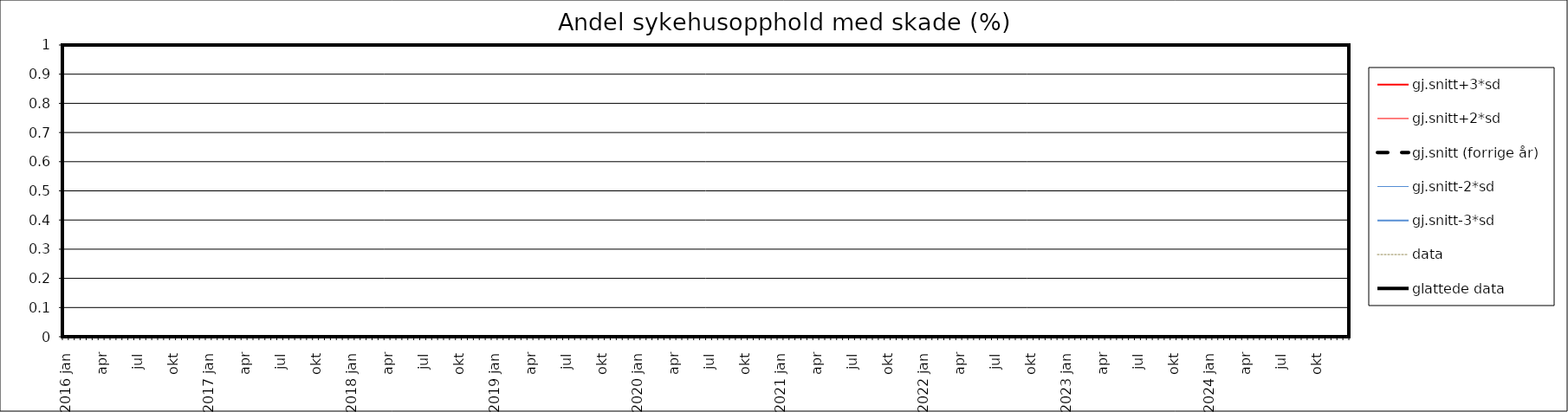
| Category | gj.snitt+3*sd | gj.snitt+2*sd | gj.snitt (forrige år) | gj.snitt-2*sd | gj.snitt-3*sd | data | glattede data |
|---|---|---|---|---|---|---|---|
| 2016 jan | 0 | 0 | 0 | 0 | 0 | 0 | 0 |
|  | 0 | 0 | 0 | 0 | 0 | 0 | 0 |
| feb | 0 | 0 | 0 | 0 | 0 | 0 | 0 |
|  | 0 | 0 | 0 | 0 | 0 | 0 | 0 |
| mar | 0 | 0 | 0 | 0 | 0 | 0 | 0 |
|  | 0 | 0 | 0 | 0 | 0 | 0 | 0 |
| apr | 0 | 0 | 0 | 0 | 0 | 0 | 0 |
|  | 0 | 0 | 0 | 0 | 0 | 0 | 0 |
| mai | 0 | 0 | 0 | 0 | 0 | 0 | 0 |
|  | 0 | 0 | 0 | 0 | 0 | 0 | 0 |
| jun | 0 | 0 | 0 | 0 | 0 | 0 | 0 |
|  | 0 | 0 | 0 | 0 | 0 | 0 | 0 |
| jul | 0 | 0 | 0 | 0 | 0 | 0 | 0 |
|  | 0 | 0 | 0 | 0 | 0 | 0 | 0 |
| aug | 0 | 0 | 0 | 0 | 0 | 0 | 0 |
|  | 0 | 0 | 0 | 0 | 0 | 0 | 0 |
| sep | 0 | 0 | 0 | 0 | 0 | 0 | 0 |
|  | 0 | 0 | 0 | 0 | 0 | 0 | 0 |
| okt | 0 | 0 | 0 | 0 | 0 | 0 | 0 |
|  | 0 | 0 | 0 | 0 | 0 | 0 | 0 |
| nov | 0 | 0 | 0 | 0 | 0 | 0 | 0 |
|  | 0 | 0 | 0 | 0 | 0 | 0 | 0 |
| des | 0 | 0 | 0 | 0 | 0 | 0 | 0 |
|  | 0 | 0 | 0 | 0 | 0 | 0 | 0 |
| 2017 jan | 0 | 0 | 0 | 0 | 0 | 0 | 0 |
|  | 0 | 0 | 0 | 0 | 0 | 0 | 0 |
| feb | 0 | 0 | 0 | 0 | 0 | 0 | 0 |
|  | 0 | 0 | 0 | 0 | 0 | 0 | 0 |
| mar | 0 | 0 | 0 | 0 | 0 | 0 | 0 |
|  | 0 | 0 | 0 | 0 | 0 | 0 | 0 |
| apr | 0 | 0 | 0 | 0 | 0 | 0 | 0 |
|  | 0 | 0 | 0 | 0 | 0 | 0 | 0 |
| mai | 0 | 0 | 0 | 0 | 0 | 0 | 0 |
|  | 0 | 0 | 0 | 0 | 0 | 0 | 0 |
| jun | 0 | 0 | 0 | 0 | 0 | 0 | 0 |
|  | 0 | 0 | 0 | 0 | 0 | 0 | 0 |
| jul | 0 | 0 | 0 | 0 | 0 | 0 | 0 |
|  | 0 | 0 | 0 | 0 | 0 | 0 | 0 |
| aug | 0 | 0 | 0 | 0 | 0 | 0 | 0 |
|  | 0 | 0 | 0 | 0 | 0 | 0 | 0 |
| sep | 0 | 0 | 0 | 0 | 0 | 0 | 0 |
|  | 0 | 0 | 0 | 0 | 0 | 0 | 0 |
| okt | 0 | 0 | 0 | 0 | 0 | 0 | 0 |
|  | 0 | 0 | 0 | 0 | 0 | 0 | 0 |
| nov | 0 | 0 | 0 | 0 | 0 | 0 | 0 |
|  | 0 | 0 | 0 | 0 | 0 | 0 | 0 |
| des | 0 | 0 | 0 | 0 | 0 | 0 | 0 |
|  | 0 | 0 | 0 | 0 | 0 | 0 | 0 |
| 2018 jan | 0 | 0 | 0 | 0 | 0 | 0 | 0 |
|  | 0 | 0 | 0 | 0 | 0 | 0 | 0 |
| feb | 0 | 0 | 0 | 0 | 0 | 0 | 0 |
|  | 0 | 0 | 0 | 0 | 0 | 0 | 0 |
| mar | 0 | 0 | 0 | 0 | 0 | 0 | 0 |
|  | 0 | 0 | 0 | 0 | 0 | 0 | 0 |
| apr | 0 | 0 | 0 | 0 | 0 | 0 | 0 |
|  | 0 | 0 | 0 | 0 | 0 | 0 | 0 |
| mai | 0 | 0 | 0 | 0 | 0 | 0 | 0 |
|  | 0 | 0 | 0 | 0 | 0 | 0 | 0 |
| jun | 0 | 0 | 0 | 0 | 0 | 0 | 0 |
|  | 0 | 0 | 0 | 0 | 0 | 0 | 0 |
| jul | 0 | 0 | 0 | 0 | 0 | 0 | 0 |
|  | 0 | 0 | 0 | 0 | 0 | 0 | 0 |
| aug | 0 | 0 | 0 | 0 | 0 | 0 | 0 |
|  | 0 | 0 | 0 | 0 | 0 | 0 | 0 |
| sep | 0 | 0 | 0 | 0 | 0 | 0 | 0 |
|  | 0 | 0 | 0 | 0 | 0 | 0 | 0 |
| okt | 0 | 0 | 0 | 0 | 0 | 0 | 0 |
|  | 0 | 0 | 0 | 0 | 0 | 0 | 0 |
| nov | 0 | 0 | 0 | 0 | 0 | 0 | 0 |
|  | 0 | 0 | 0 | 0 | 0 | 0 | 0 |
| des | 0 | 0 | 0 | 0 | 0 | 0 | 0 |
|  | 0 | 0 | 0 | 0 | 0 | 0 | 0 |
| 2019 jan | 0 | 0 | 0 | 0 | 0 | 0 | 0 |
|  | 0 | 0 | 0 | 0 | 0 | 0 | 0 |
| feb | 0 | 0 | 0 | 0 | 0 | 0 | 0 |
|  | 0 | 0 | 0 | 0 | 0 | 0 | 0 |
| mar | 0 | 0 | 0 | 0 | 0 | 0 | 0 |
|  | 0 | 0 | 0 | 0 | 0 | 0 | 0 |
| apr | 0 | 0 | 0 | 0 | 0 | 0 | 0 |
|  | 0 | 0 | 0 | 0 | 0 | 0 | 0 |
| mai | 0 | 0 | 0 | 0 | 0 | 0 | 0 |
|  | 0 | 0 | 0 | 0 | 0 | 0 | 0 |
| jun | 0 | 0 | 0 | 0 | 0 | 0 | 0 |
|  | 0 | 0 | 0 | 0 | 0 | 0 | 0 |
| jul | 0 | 0 | 0 | 0 | 0 | 0 | 0 |
|  | 0 | 0 | 0 | 0 | 0 | 0 | 0 |
| aug | 0 | 0 | 0 | 0 | 0 | 0 | 0 |
|  | 0 | 0 | 0 | 0 | 0 | 0 | 0 |
| sep | 0 | 0 | 0 | 0 | 0 | 0 | 0 |
|  | 0 | 0 | 0 | 0 | 0 | 0 | 0 |
| okt | 0 | 0 | 0 | 0 | 0 | 0 | 0 |
|  | 0 | 0 | 0 | 0 | 0 | 0 | 0 |
| nov | 0 | 0 | 0 | 0 | 0 | 0 | 0 |
|  | 0 | 0 | 0 | 0 | 0 | 0 | 0 |
| des | 0 | 0 | 0 | 0 | 0 | 0 | 0 |
|  | 0 | 0 | 0 | 0 | 0 | 0 | 0 |
| 2020 jan | 0 | 0 | 0 | 0 | 0 | 0 | 0 |
|  | 0 | 0 | 0 | 0 | 0 | 0 | 0 |
| feb | 0 | 0 | 0 | 0 | 0 | 0 | 0 |
|  | 0 | 0 | 0 | 0 | 0 | 0 | 0 |
| mar | 0 | 0 | 0 | 0 | 0 | 0 | 0 |
|  | 0 | 0 | 0 | 0 | 0 | 0 | 0 |
| apr | 0 | 0 | 0 | 0 | 0 | 0 | 0 |
|  | 0 | 0 | 0 | 0 | 0 | 0 | 0 |
| mai | 0 | 0 | 0 | 0 | 0 | 0 | 0 |
|  | 0 | 0 | 0 | 0 | 0 | 0 | 0 |
| jun | 0 | 0 | 0 | 0 | 0 | 0 | 0 |
|  | 0 | 0 | 0 | 0 | 0 | 0 | 0 |
| jul | 0 | 0 | 0 | 0 | 0 | 0 | 0 |
|  | 0 | 0 | 0 | 0 | 0 | 0 | 0 |
| aug | 0 | 0 | 0 | 0 | 0 | 0 | 0 |
|  | 0 | 0 | 0 | 0 | 0 | 0 | 0 |
| sep | 0 | 0 | 0 | 0 | 0 | 0 | 0 |
|  | 0 | 0 | 0 | 0 | 0 | 0 | 0 |
| okt | 0 | 0 | 0 | 0 | 0 | 0 | 0 |
|  | 0 | 0 | 0 | 0 | 0 | 0 | 0 |
| nov | 0 | 0 | 0 | 0 | 0 | 0 | 0 |
|  | 0 | 0 | 0 | 0 | 0 | 0 | 0 |
| des | 0 | 0 | 0 | 0 | 0 | 0 | 0 |
|  | 0 | 0 | 0 | 0 | 0 | 0 | 0 |
| 2021 jan | 0 | 0 | 0 | 0 | 0 | 0 | 0 |
|  | 0 | 0 | 0 | 0 | 0 | 0 | 0 |
| feb | 0 | 0 | 0 | 0 | 0 | 0 | 0 |
|  | 0 | 0 | 0 | 0 | 0 | 0 | 0 |
| mar | 0 | 0 | 0 | 0 | 0 | 0 | 0 |
|  | 0 | 0 | 0 | 0 | 0 | 0 | 0 |
| apr | 0 | 0 | 0 | 0 | 0 | 0 | 0 |
|  | 0 | 0 | 0 | 0 | 0 | 0 | 0 |
| mai | 0 | 0 | 0 | 0 | 0 | 0 | 0 |
|  | 0 | 0 | 0 | 0 | 0 | 0 | 0 |
| jun | 0 | 0 | 0 | 0 | 0 | 0 | 0 |
|  | 0 | 0 | 0 | 0 | 0 | 0 | 0 |
| jul | 0 | 0 | 0 | 0 | 0 | 0 | 0 |
|  | 0 | 0 | 0 | 0 | 0 | 0 | 0 |
| aug | 0 | 0 | 0 | 0 | 0 | 0 | 0 |
|  | 0 | 0 | 0 | 0 | 0 | 0 | 0 |
| sep | 0 | 0 | 0 | 0 | 0 | 0 | 0 |
|  | 0 | 0 | 0 | 0 | 0 | 0 | 0 |
| okt | 0 | 0 | 0 | 0 | 0 | 0 | 0 |
|  | 0 | 0 | 0 | 0 | 0 | 0 | 0 |
| nov | 0 | 0 | 0 | 0 | 0 | 0 | 0 |
|  | 0 | 0 | 0 | 0 | 0 | 0 | 0 |
| des | 0 | 0 | 0 | 0 | 0 | 0 | 0 |
|  | 0 | 0 | 0 | 0 | 0 | 0 | 0 |
| 2022 jan | 0 | 0 | 0 | 0 | 0 | 0 | 0 |
|  | 0 | 0 | 0 | 0 | 0 | 0 | 0 |
| feb | 0 | 0 | 0 | 0 | 0 | 0 | 0 |
|  | 0 | 0 | 0 | 0 | 0 | 0 | 0 |
| mar | 0 | 0 | 0 | 0 | 0 | 0 | 0 |
|  | 0 | 0 | 0 | 0 | 0 | 0 | 0 |
| apr | 0 | 0 | 0 | 0 | 0 | 0 | 0 |
|  | 0 | 0 | 0 | 0 | 0 | 0 | 0 |
| mai | 0 | 0 | 0 | 0 | 0 | 0 | 0 |
|  | 0 | 0 | 0 | 0 | 0 | 0 | 0 |
| jun | 0 | 0 | 0 | 0 | 0 | 0 | 0 |
|  | 0 | 0 | 0 | 0 | 0 | 0 | 0 |
| jul | 0 | 0 | 0 | 0 | 0 | 0 | 0 |
|  | 0 | 0 | 0 | 0 | 0 | 0 | 0 |
| aug | 0 | 0 | 0 | 0 | 0 | 0 | 0 |
|  | 0 | 0 | 0 | 0 | 0 | 0 | 0 |
| sep | 0 | 0 | 0 | 0 | 0 | 0 | 0 |
|  | 0 | 0 | 0 | 0 | 0 | 0 | 0 |
| okt | 0 | 0 | 0 | 0 | 0 | 0 | 0 |
|  | 0 | 0 | 0 | 0 | 0 | 0 | 0 |
| nov | 0 | 0 | 0 | 0 | 0 | 0 | 0 |
|  | 0 | 0 | 0 | 0 | 0 | 0 | 0 |
| des | 0 | 0 | 0 | 0 | 0 | 0 | 0 |
|  | 0 | 0 | 0 | 0 | 0 | 0 | 0 |
| 2023 jan | 0 | 0 | 0 | 0 | 0 | 0 | 0 |
|  | 0 | 0 | 0 | 0 | 0 | 0 | 0 |
| feb | 0 | 0 | 0 | 0 | 0 | 0 | 0 |
|  | 0 | 0 | 0 | 0 | 0 | 0 | 0 |
| mar | 0 | 0 | 0 | 0 | 0 | 0 | 0 |
|  | 0 | 0 | 0 | 0 | 0 | 0 | 0 |
| apr | 0 | 0 | 0 | 0 | 0 | 0 | 0 |
|  | 0 | 0 | 0 | 0 | 0 | 0 | 0 |
| mai | 0 | 0 | 0 | 0 | 0 | 0 | 0 |
|  | 0 | 0 | 0 | 0 | 0 | 0 | 0 |
| jun | 0 | 0 | 0 | 0 | 0 | 0 | 0 |
|  | 0 | 0 | 0 | 0 | 0 | 0 | 0 |
| jul | 0 | 0 | 0 | 0 | 0 | 0 | 0 |
|  | 0 | 0 | 0 | 0 | 0 | 0 | 0 |
| aug | 0 | 0 | 0 | 0 | 0 | 0 | 0 |
|  | 0 | 0 | 0 | 0 | 0 | 0 | 0 |
| sep | 0 | 0 | 0 | 0 | 0 | 0 | 0 |
|  | 0 | 0 | 0 | 0 | 0 | 0 | 0 |
| okt | 0 | 0 | 0 | 0 | 0 | 0 | 0 |
|  | 0 | 0 | 0 | 0 | 0 | 0 | 0 |
| nov | 0 | 0 | 0 | 0 | 0 | 0 | 0 |
|  | 0 | 0 | 0 | 0 | 0 | 0 | 0 |
| des | 0 | 0 | 0 | 0 | 0 | 0 | 0 |
|  | 0 | 0 | 0 | 0 | 0 | 0 | 0 |
| 2024 jan | 0 | 0 | 0 | 0 | 0 | 0 | 0 |
|  | 0 | 0 | 0 | 0 | 0 | 0 | 0 |
| feb | 0 | 0 | 0 | 0 | 0 | 0 | 0 |
|  | 0 | 0 | 0 | 0 | 0 | 0 | 0 |
| mar | 0 | 0 | 0 | 0 | 0 | 0 | 0 |
|  | 0 | 0 | 0 | 0 | 0 | 0 | 0 |
| apr | 0 | 0 | 0 | 0 | 0 | 0 | 0 |
|  | 0 | 0 | 0 | 0 | 0 | 0 | 0 |
| mai | 0 | 0 | 0 | 0 | 0 | 0 | 0 |
|  | 0 | 0 | 0 | 0 | 0 | 0 | 0 |
| jun | 0 | 0 | 0 | 0 | 0 | 0 | 0 |
|  | 0 | 0 | 0 | 0 | 0 | 0 | 0 |
| jul | 0 | 0 | 0 | 0 | 0 | 0 | 0 |
|  | 0 | 0 | 0 | 0 | 0 | 0 | 0 |
| aug | 0 | 0 | 0 | 0 | 0 | 0 | 0 |
|  | 0 | 0 | 0 | 0 | 0 | 0 | 0 |
| sep | 0 | 0 | 0 | 0 | 0 | 0 | 0 |
|  | 0 | 0 | 0 | 0 | 0 | 0 | 0 |
| okt | 0 | 0 | 0 | 0 | 0 | 0 | 0 |
|  | 0 | 0 | 0 | 0 | 0 | 0 | 0 |
| nov | 0 | 0 | 0 | 0 | 0 | 0 | 0 |
|  | 0 | 0 | 0 | 0 | 0 | 0 | 0 |
| des | 0 | 0 | 0 | 0 | 0 | 0 | 0 |